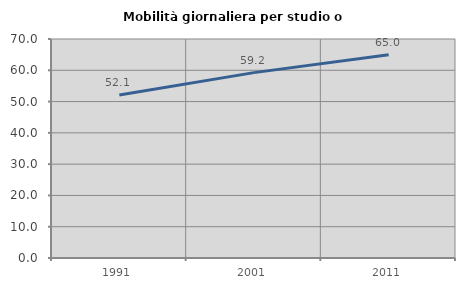
| Category | Mobilità giornaliera per studio o lavoro |
|---|---|
| 1991.0 | 52.113 |
| 2001.0 | 59.249 |
| 2011.0 | 64.986 |